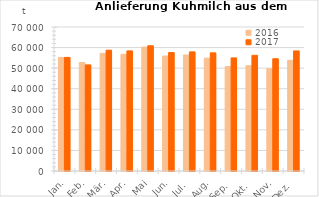
| Category | 2016 | 2017 |
|---|---|---|
| Jan. | 55201.671 | 55225.614 |
| Feb. | 52732.022 | 51583.665 |
| Mär. | 57201.879 | 58734.297 |
| Apr. | 56724.23 | 58386.965 |
| Mai | 60239.628 | 60883.604 |
| Jun. | 55891.219 | 57592.644 |
| Jul. | 56397.297 | 57907.417 |
| Aug. | 54839.944 | 57443.481 |
| Sep. | 50799.394 | 54976.951 |
| Okt. | 51193.231 | 56223.032 |
| Nov. | 49712.949 | 54566.886 |
| Dez. | 53829.32 | 58370.223 |